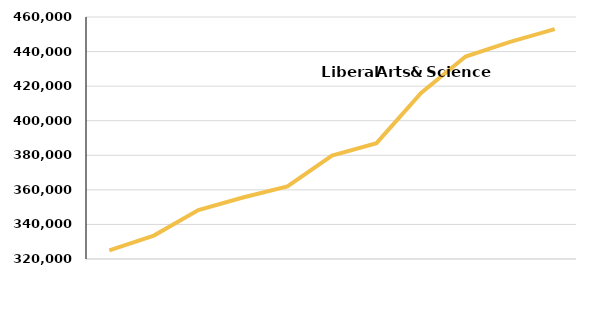
| Category | Liberal Arts and Sciences |
|---|---|
| FY2007 | 324982 |
| FY2008 | 333566 |
| FY2009 | 348309 |
| FY2010 | 355568 |
| FY2011 | 361966 |
| FY2012 | 379796 |
| FY2013 | 387040 |
| FY2014 | 416019 |
| FY2015 | 437142.53 |
| FY2016 | 445653.69 |
| FY2017 | 452950.694 |